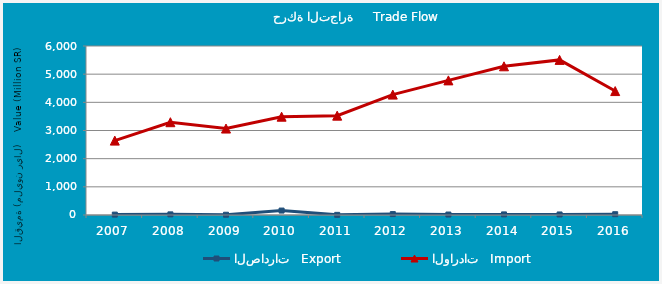
| Category | الصادرات   Export | الواردات   Import |
|---|---|---|
| 2007.0 | 13.32 | 2641.016 |
| 2008.0 | 22.265 | 3294.532 |
| 2009.0 | 9.11 | 3069.004 |
| 2010.0 | 157.107 | 3490.356 |
| 2011.0 | 5.368 | 3526.623 |
| 2012.0 | 32.729 | 4274.561 |
| 2013.0 | 16.482 | 4779.569 |
| 2014.0 | 21.244 | 5279.323 |
| 2015.0 | 18.867 | 5506.447 |
| 2016.0 | 27.968 | 4400.121 |